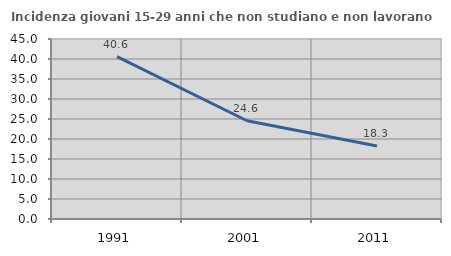
| Category | Incidenza giovani 15-29 anni che non studiano e non lavorano  |
|---|---|
| 1991.0 | 40.613 |
| 2001.0 | 24.556 |
| 2011.0 | 18.257 |